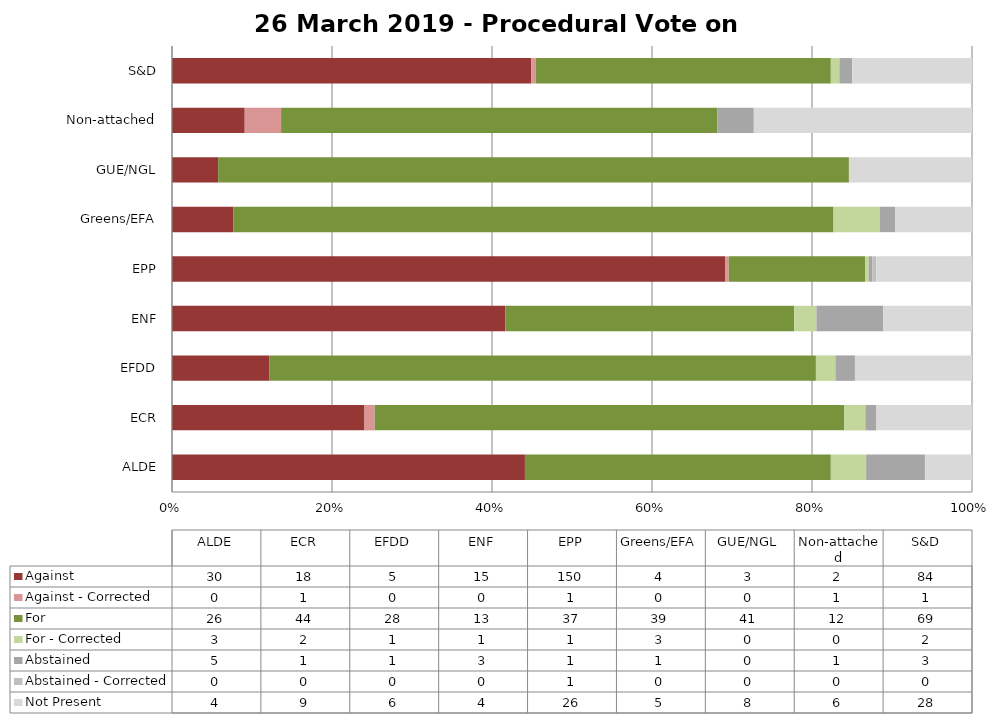
| Category | Against | Against - Corrected | For | For - Corrected | Abstained | Abstained - Corrected | Not Present |
|---|---|---|---|---|---|---|---|
| ALDE | 30 | 0 | 26 | 3 | 5 | 0 | 4 |
| ECR | 18 | 1 | 44 | 2 | 1 | 0 | 9 |
| EFDD | 5 | 0 | 28 | 1 | 1 | 0 | 6 |
| ENF | 15 | 0 | 13 | 1 | 3 | 0 | 4 |
| EPP | 150 | 1 | 37 | 1 | 1 | 1 | 26 |
| Greens/EFA | 4 | 0 | 39 | 3 | 1 | 0 | 5 |
| GUE/NGL | 3 | 0 | 41 | 0 | 0 | 0 | 8 |
| Non-attached | 2 | 1 | 12 | 0 | 1 | 0 | 6 |
| S&D | 84 | 1 | 69 | 2 | 3 | 0 | 28 |